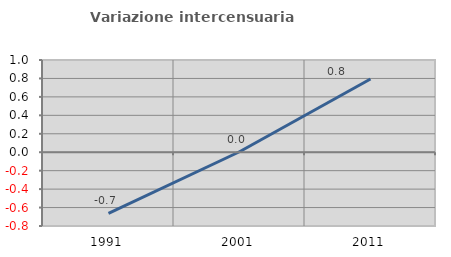
| Category | Variazione intercensuaria annua |
|---|---|
| 1991.0 | -0.663 |
| 2001.0 | 0.005 |
| 2011.0 | 0.794 |